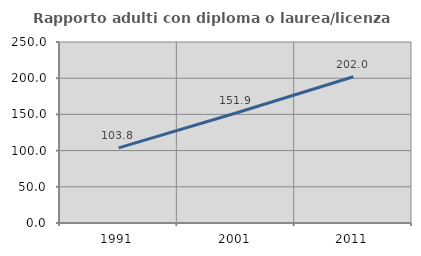
| Category | Rapporto adulti con diploma o laurea/licenza media  |
|---|---|
| 1991.0 | 103.821 |
| 2001.0 | 151.917 |
| 2011.0 | 201.978 |